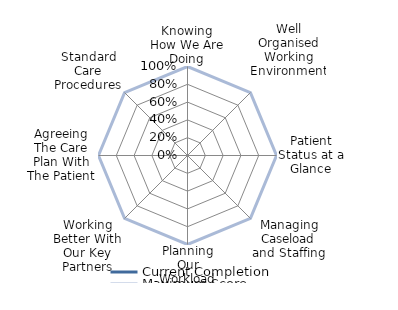
| Category | Current Completion | Maximum Score |
|---|---|---|
| Knowing How We Are Doing | 0 | 1 |
| Well Organised Working Environment | 0 | 1 |
| Patient Status at a Glance | 0 | 1 |
| Managing Caseload and Staffing | 0 | 1 |
| Planning Our Workload | 0 | 1 |
| Working Better With Our Key Partners | 0 | 1 |
| Agreeing The Care Plan With The Patient | 0 | 1 |
| Standard Care Procedures | 0 | 1 |